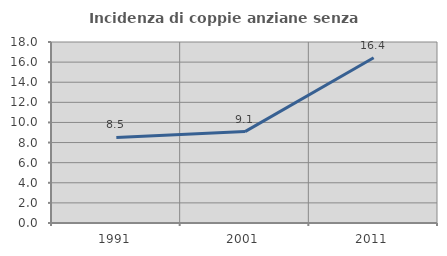
| Category | Incidenza di coppie anziane senza figli  |
|---|---|
| 1991.0 | 8.511 |
| 2001.0 | 9.091 |
| 2011.0 | 16.438 |